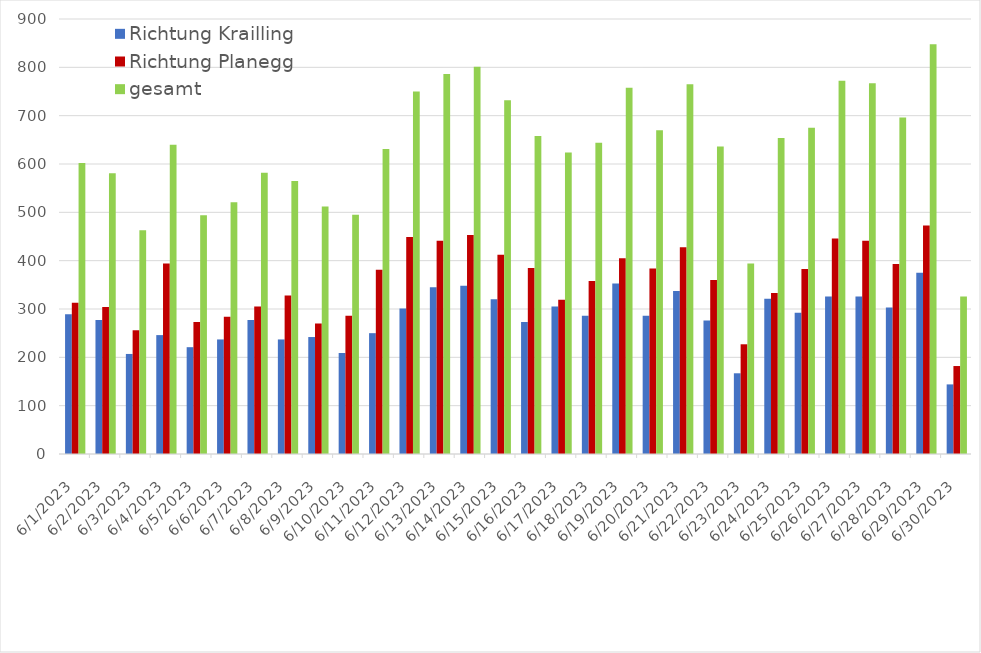
| Category | Richtung Krailling | Richtung Planegg | gesamt |
|---|---|---|---|
| 6/1/23 | 289 | 313 | 602 |
| 6/2/23 | 277 | 304 | 581 |
| 6/3/23 | 207 | 256 | 463 |
| 6/4/23 | 246 | 394 | 640 |
| 6/5/23 | 221 | 273 | 494 |
| 6/6/23 | 237 | 284 | 521 |
| 6/7/23 | 277 | 305 | 582 |
| 6/8/23 | 237 | 328 | 565 |
| 6/9/23 | 242 | 270 | 512 |
| 6/10/23 | 209 | 286 | 495 |
| 6/11/23 | 250 | 381 | 631 |
| 6/12/23 | 301 | 449 | 750 |
| 6/13/23 | 345 | 441 | 786 |
| 6/14/23 | 348 | 453 | 801 |
| 6/15/23 | 320 | 412 | 732 |
| 6/16/23 | 273 | 385 | 658 |
| 6/17/23 | 305 | 319 | 624 |
| 6/18/23 | 286 | 358 | 644 |
| 6/19/23 | 353 | 405 | 758 |
| 6/20/23 | 286 | 384 | 670 |
| 6/21/23 | 337 | 428 | 765 |
| 6/22/23 | 276 | 360 | 636 |
| 6/23/23 | 167 | 227 | 394 |
| 6/24/23 | 321 | 333 | 654 |
| 6/25/23 | 292 | 383 | 675 |
| 6/26/23 | 326 | 446 | 772 |
| 6/27/23 | 326 | 441 | 767 |
| 6/28/23 | 303 | 393 | 696 |
| 6/29/23 | 375 | 473 | 848 |
| 6/30/23 | 144 | 182 | 326 |